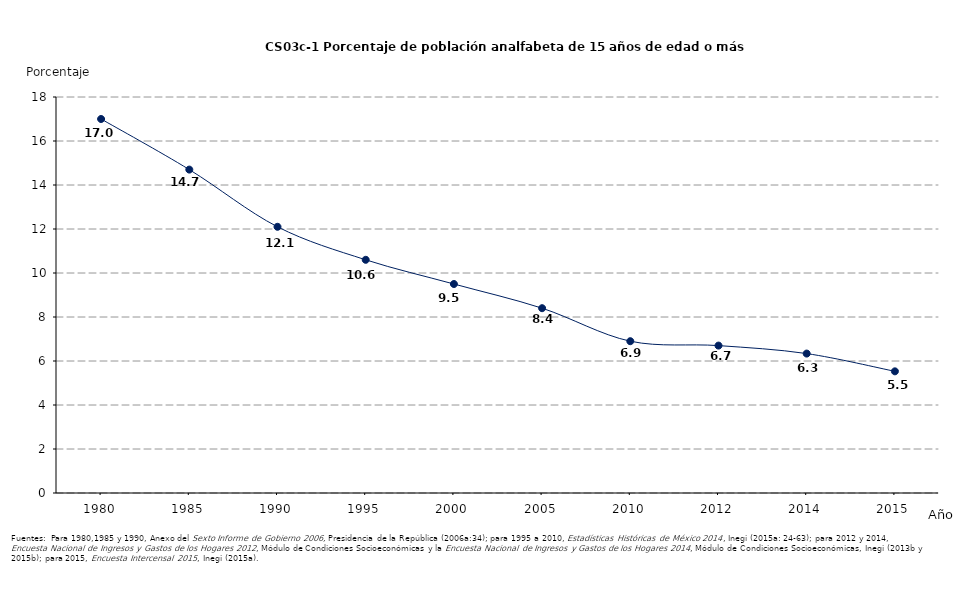
| Category | Series 0 |
|---|---|
| 1980.0 | 17 |
| 1985.0 | 14.7 |
| 1990.0 | 12.1 |
| 1995.0 | 10.6 |
| 2000.0 | 9.5 |
| 2005.0 | 8.4 |
| 2010.0 | 6.9 |
| 2012.0 | 6.7 |
| 2014.0 | 6.338 |
| 2015.0 | 5.53 |